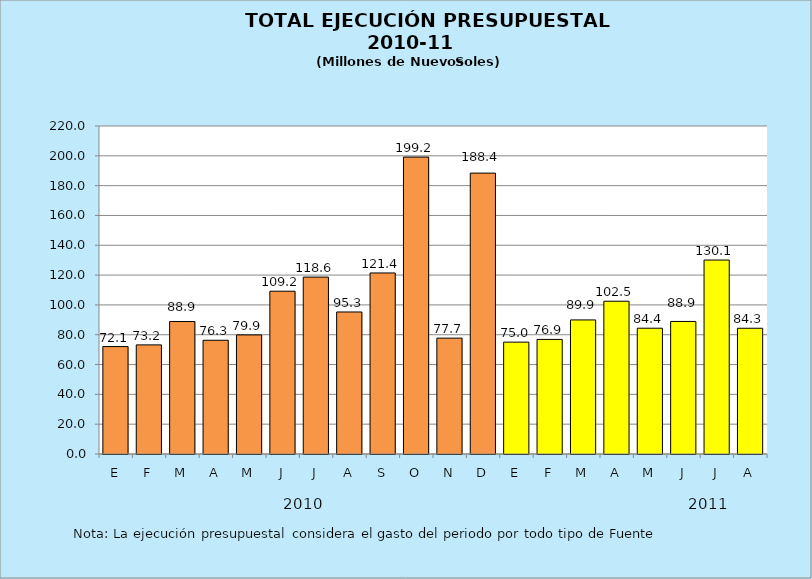
| Category | Series 0 |
|---|---|
| E | 72.06 |
| F | 73.19 |
| M | 88.855 |
| A | 76.285 |
| M | 79.872 |
| J | 109.187 |
| J | 118.647 |
| A | 95.263 |
| S | 121.433 |
| O | 199.151 |
| N | 77.711 |
| D | 188.401 |
| E | 75.038 |
| F | 76.858 |
| M | 89.924 |
| A | 102.472 |
| M | 84.372 |
| J | 88.913 |
| J | 130.095 |
| A | 84.34 |